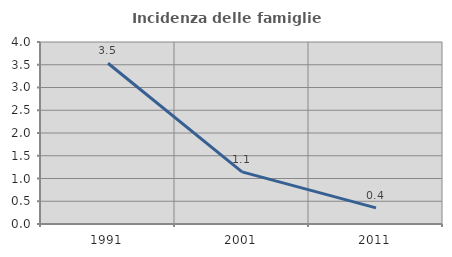
| Category | Incidenza delle famiglie numerose |
|---|---|
| 1991.0 | 3.534 |
| 2001.0 | 1.145 |
| 2011.0 | 0.355 |